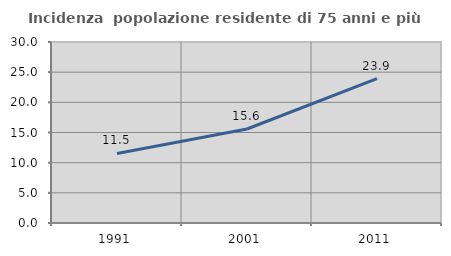
| Category | Incidenza  popolazione residente di 75 anni e più |
|---|---|
| 1991.0 | 11.527 |
| 2001.0 | 15.582 |
| 2011.0 | 23.926 |